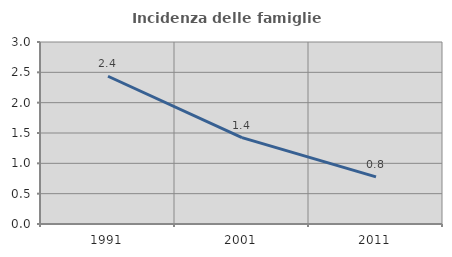
| Category | Incidenza delle famiglie numerose |
|---|---|
| 1991.0 | 2.435 |
| 2001.0 | 1.424 |
| 2011.0 | 0.778 |